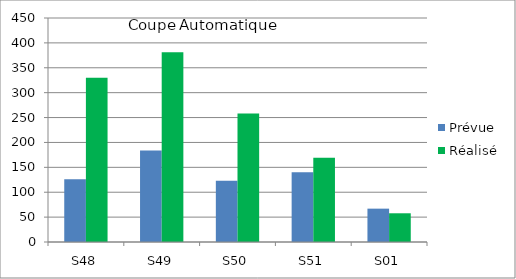
| Category | Prévue | Réalisé |
|---|---|---|
| S48 | 126 | 330 |
| S49 | 184 | 381.184 |
| S50 | 123 | 257.949 |
| S51 | 140 | 169.158 |
| S01 | 67 | 57.697 |